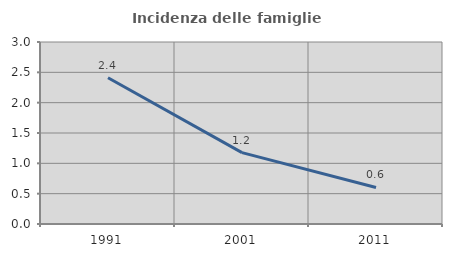
| Category | Incidenza delle famiglie numerose |
|---|---|
| 1991.0 | 2.41 |
| 2001.0 | 1.176 |
| 2011.0 | 0.602 |